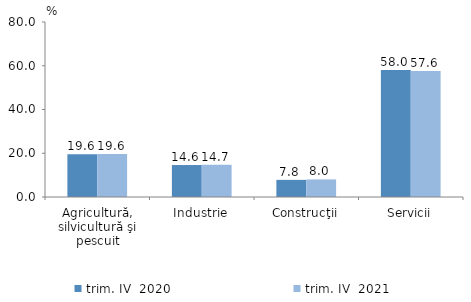
| Category | trim. IV  2020 | trim. IV  2021 |
|---|---|---|
| Agricultură, silvicultură şi pescuit | 19.558 | 19.639 |
| Industrie | 14.608 | 14.708 |
| Construcţii | 7.831 | 8.039 |
| Servicii | 58.004 | 57.614 |